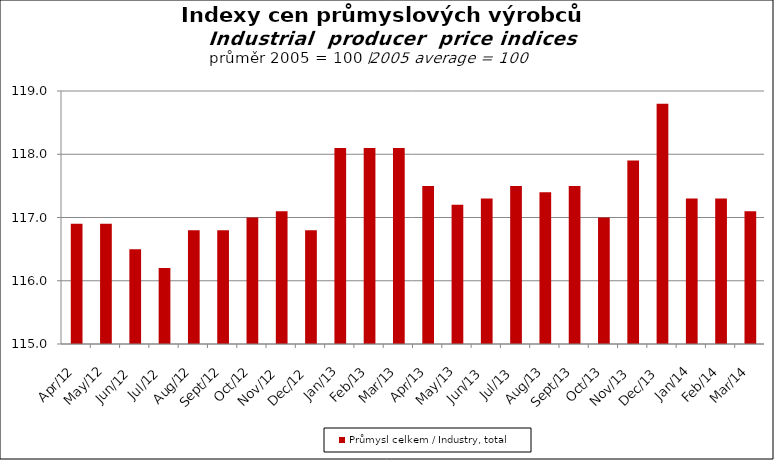
| Category | Průmysl celkem / Industry, total |
|---|---|
| 2012-04-01 | 116.9 |
| 2012-05-01 | 116.9 |
| 2012-06-01 | 116.5 |
| 2012-07-01 | 116.2 |
| 2012-08-01 | 116.8 |
| 2012-09-01 | 116.8 |
| 2012-10-01 | 117 |
| 2012-11-01 | 117.1 |
| 2012-12-01 | 116.8 |
| 2013-01-01 | 118.1 |
| 2013-02-01 | 118.1 |
| 2013-03-01 | 118.1 |
| 2013-04-01 | 117.5 |
| 2013-05-01 | 117.2 |
| 2013-06-01 | 117.3 |
| 2013-07-01 | 117.5 |
| 2013-08-01 | 117.4 |
| 2013-09-01 | 117.5 |
| 2013-10-01 | 117 |
| 2013-11-01 | 117.9 |
| 2013-12-01 | 118.8 |
| 2014-01-01 | 117.3 |
| 2014-02-01 | 117.3 |
| 2014-03-01 | 117.1 |